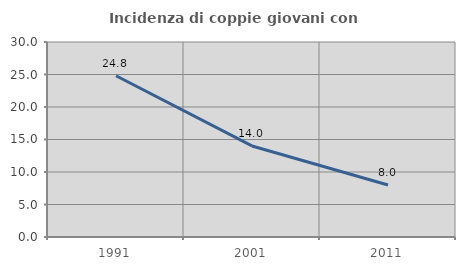
| Category | Incidenza di coppie giovani con figli |
|---|---|
| 1991.0 | 24.81 |
| 2001.0 | 14.01 |
| 2011.0 | 8 |